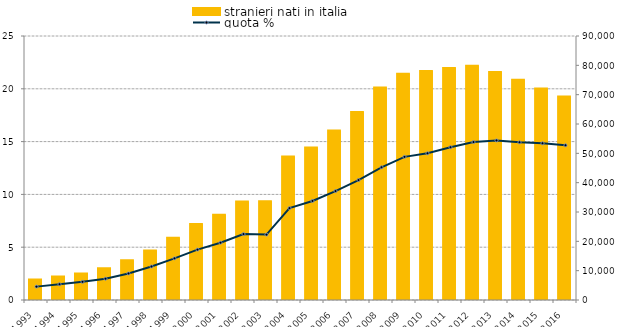
| Category | stranieri nati in italia |
|---|---|
| 1993.0 | 7000 |
| 1994.0 | 8028 |
| 1995.0 | 9061 |
| 1996.0 | 10820 |
| 1997.0 | 13569 |
| 1998.0 | 16901 |
| 1999.0 | 21186 |
| 2000.0 | 25916 |
| 2001.0 | 29054 |
| 2002.0 | 33593 |
| 2003.0 | 33691 |
| 2004.0 | 48925 |
| 2005.0 | 51971 |
| 2006.0 | 57765 |
| 2007.0 | 64049 |
| 2008.0 | 72472 |
| 2009.0 | 77109 |
| 2010.0 | 78082 |
| 2011.0 | 79074 |
| 2012.0 | 79894 |
| 2013.0 | 77705 |
| 2014.0 | 75067 |
| 2015.0 | 72096 |
| 2016.0 | 69379 |